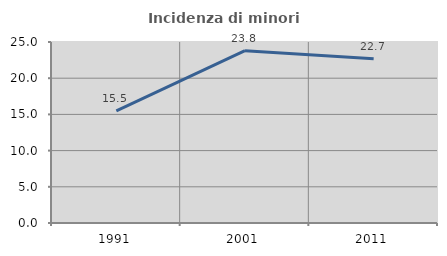
| Category | Incidenza di minori stranieri |
|---|---|
| 1991.0 | 15.493 |
| 2001.0 | 23.795 |
| 2011.0 | 22.678 |